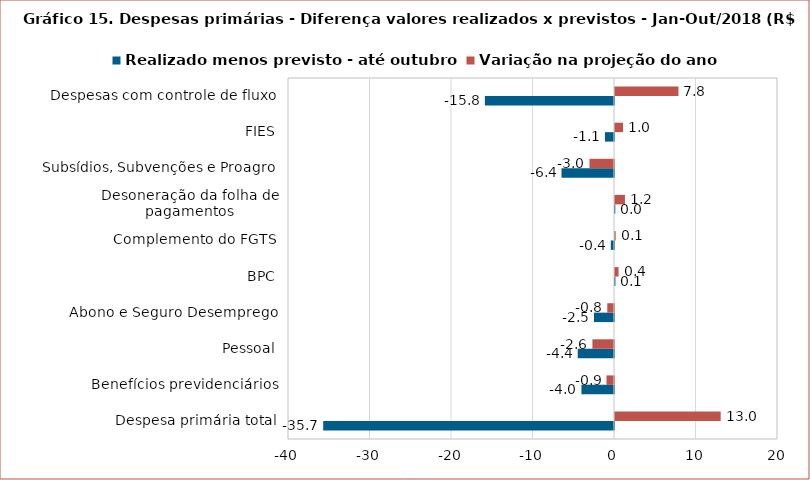
| Category | Realizado menos previsto - até outubro | Variação na projeção do ano |
|---|---|---|
| Despesa primária total | -35.681 | 12.97 |
| Benefícios previdenciários | -3.994 | -0.919 |
| Pessoal | -4.448 | -2.648 |
| Abono e Seguro Desemprego | -2.458 | -0.825 |
| BPC | 0.051 | 0.436 |
| Complemento do FGTS | -0.391 | 0.082 |
| Desoneração da folha de pagamentos | 0.037 | 1.22 |
| Subsídios, Subvenções e Proagro | -6.44 | -3.008 |
| FIES | -1.112 | 0.983 |
| Despesas com controle de fluxo | -15.842 | 7.785 |